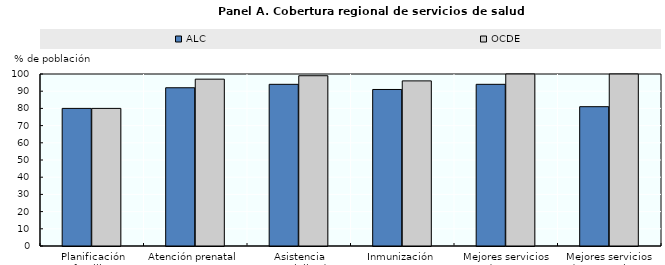
| Category | ALC | OCDE |
|---|---|---|
| Planificación familiar | 80 | 80 |
| Atención prenatal | 92 | 97 |
| Asistencia especializada durante el parto | 94 | 99 |
| Inmunización | 91 | 96 |
| Mejores servicios de agua | 94 | 100 |
| Mejores servicios de saneamiento | 81 | 100 |